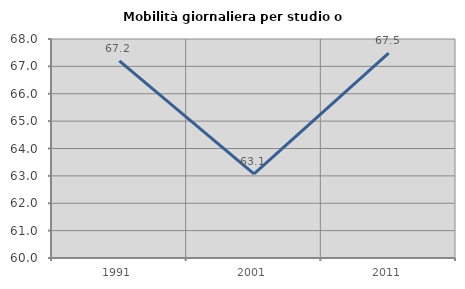
| Category | Mobilità giornaliera per studio o lavoro |
|---|---|
| 1991.0 | 67.202 |
| 2001.0 | 63.072 |
| 2011.0 | 67.487 |